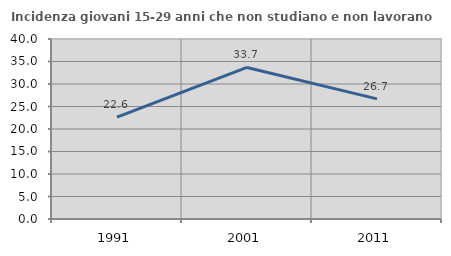
| Category | Incidenza giovani 15-29 anni che non studiano e non lavorano  |
|---|---|
| 1991.0 | 22.625 |
| 2001.0 | 33.679 |
| 2011.0 | 26.693 |